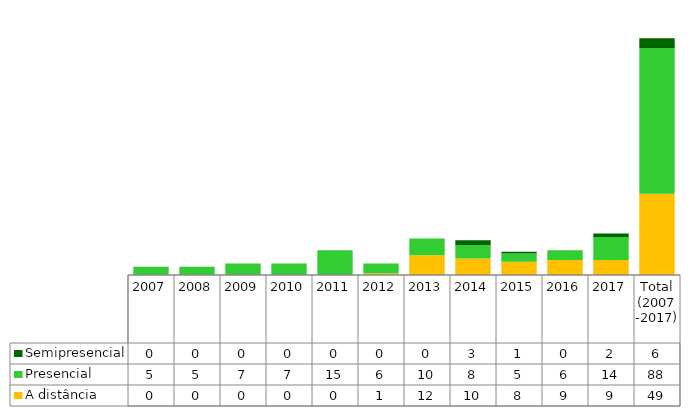
| Category | A distância | Presencial | Semipresencial |
|---|---|---|---|
| 2007 | 0 | 5 | 0 |
| 2008 | 0 | 5 | 0 |
| 2009 | 0 | 7 | 0 |
| 2010 | 0 | 7 | 0 |
| 2011 | 0 | 15 | 0 |
| 2012 | 1 | 6 | 0 |
| 2013 | 12 | 10 | 0 |
| 2014 | 10 | 8 | 3 |
| 2015 | 8 | 5 | 1 |
| 2016 | 9 | 6 | 0 |
| 2017 | 9 | 14 | 2 |
| Total (2007 -2017) | 49 | 88 | 6 |